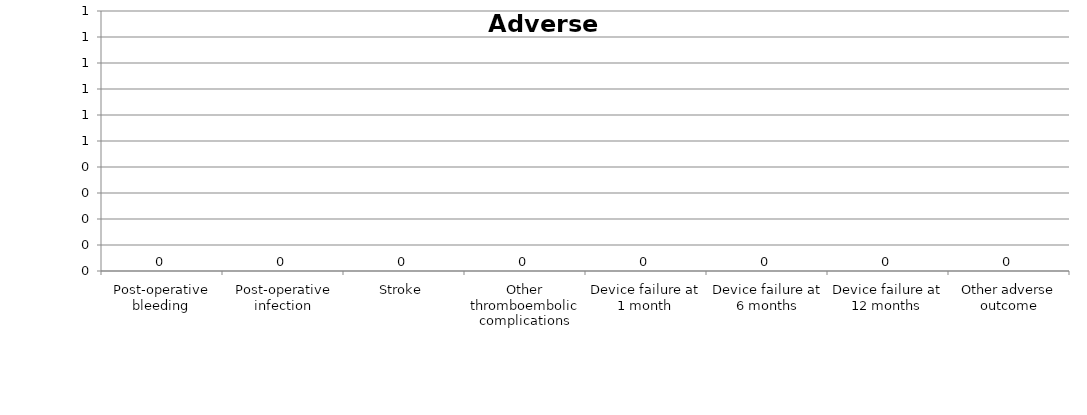
| Category | Series 0 |
|---|---|
| Post-operative bleeding | 0 |
| Post-operative infection | 0 |
| Stroke | 0 |
| Other thromboembolic complications | 0 |
| Device failure at 1 month | 0 |
| Device failure at 6 months | 0 |
| Device failure at 12 months | 0 |
| Other adverse outcome | 0 |